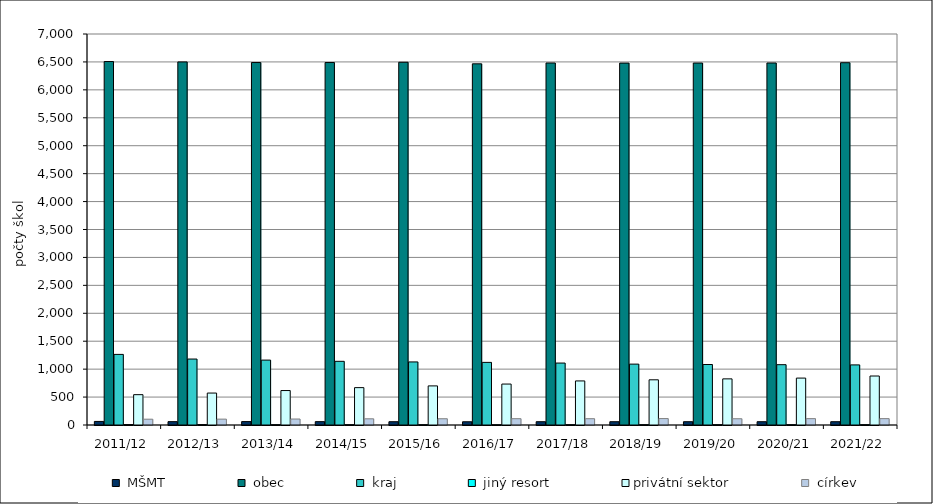
| Category |  MŠMT |  obec |  kraj |  jiný resort | privátní sektor |  církev |
|---|---|---|---|---|---|---|
| 2011/12 | 64 | 6507 | 1264 | 8 | 543 | 104 |
| 2012/13 | 60 | 6500 | 1181 | 8 | 572 | 105 |
| 2013/14 | 61 | 6489 | 1162 | 6 | 617 | 107 |
| 2014/15 | 60 | 6489 | 1140 | 6 | 669 | 111 |
| 2015/16 | 59 | 6494 | 1129 | 6 | 700 | 112 |
| 2016/17 | 58 | 6466 | 1121 | 5 | 733 | 113 |
| 2017/18 | 59 | 6481 | 1109 | 6 | 789 | 113 |
| 2018/19 | 59 | 6479 | 1090 | 6 | 809 | 115 |
| 2019/20 | 59 | 6480 | 1083 | 6 | 826 | 112 |
| 2020/21 | 59 | 6481 | 1080 | 6 | 840 | 114 |
| 2021/22 | 59 | 6486 | 1076 | 6 | 877 | 114 |